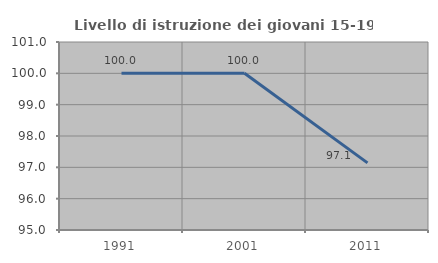
| Category | Livello di istruzione dei giovani 15-19 anni |
|---|---|
| 1991.0 | 100 |
| 2001.0 | 100 |
| 2011.0 | 97.143 |